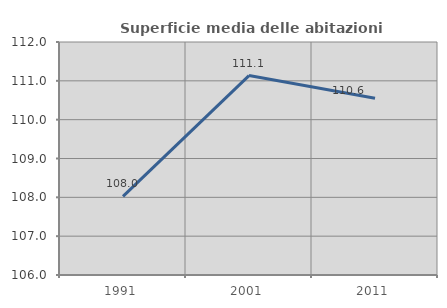
| Category | Superficie media delle abitazioni occupate |
|---|---|
| 1991.0 | 108.026 |
| 2001.0 | 111.136 |
| 2011.0 | 110.552 |